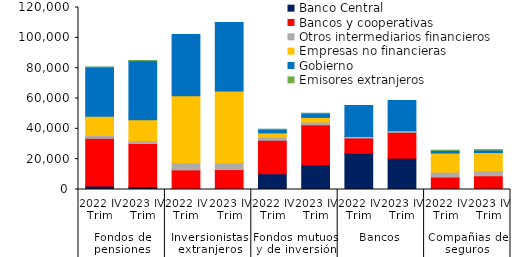
| Category | Banco Central | Bancos y cooperativas | Otros intermediarios financieros | Empresas no financieras | Gobierno  | Emisores extranjeros |
|---|---|---|---|---|---|---|
| 0 | 2319.069 | 31440.4 | 1913.597 | 12550.179 | 32443.075 | 35.111 |
| 1 | 1911.188 | 28424.563 | 1961.054 | 13715.802 | 38954.862 | 36.789 |
| 2 | 527.928 | 12375.297 | 4787.118 | 44177.225 | 40411.994 | 0 |
| 3 | 214.047 | 12912.028 | 4504.533 | 47355.451 | 45184.44 | 0 |
| 4 | 10308.337 | 22150.029 | 1963.909 | 2920.05 | 2313.941 | 0.176 |
| 5 | 16200.784 | 26423.459 | 1844.773 | 3081.062 | 2656.059 | 0.184 |
| 6 | 23834.964 | 10145.153 | 523.78 | 433.517 | 20371.824 | 0 |
| 7 | 20623.648 | 17079.342 | 523.596 | 530.627 | 19921.592 | 0 |
| 8 | 86.635 | 8084.208 | 3271.588 | 12617.927 | 1689.902 | 140.268 |
| 9 | 230.199 | 8822.501 | 3138.383 | 12160.494 | 1637.002 | 126.96 |